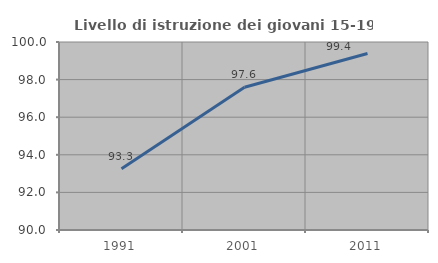
| Category | Livello di istruzione dei giovani 15-19 anni |
|---|---|
| 1991.0 | 93.264 |
| 2001.0 | 97.59 |
| 2011.0 | 99.39 |